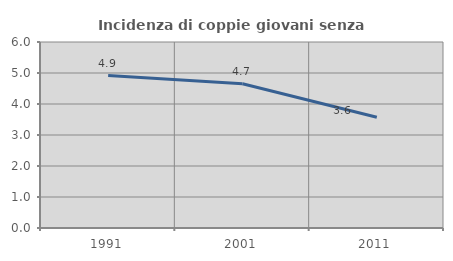
| Category | Incidenza di coppie giovani senza figli |
|---|---|
| 1991.0 | 4.918 |
| 2001.0 | 4.651 |
| 2011.0 | 3.571 |